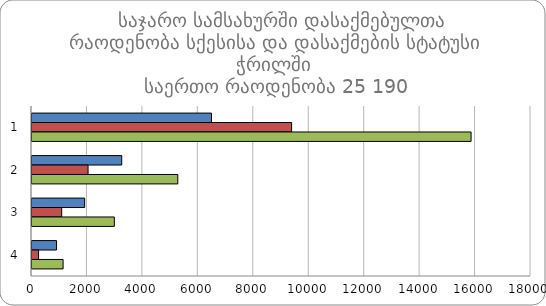
| Category |  მამრობითი |  მდედრობითი | ჯამი |
|---|---|---|---|
| 0 | 6474 | 9365 | 15839 |
| 1 | 3237 | 2022 | 5259 |
| 2 | 1899 | 1071 | 2970 |
| 3 | 885 | 237 | 1122 |